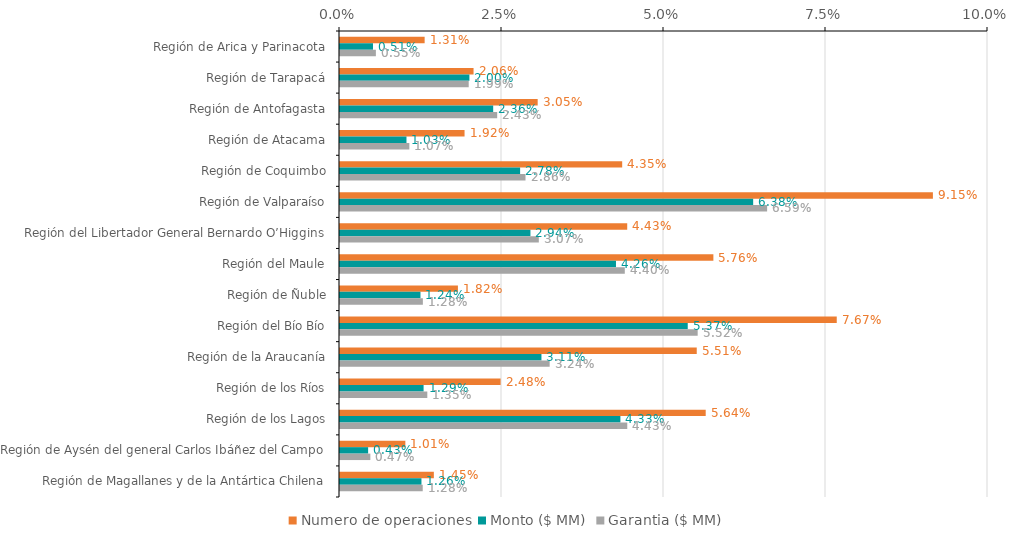
| Category | Numero de operaciones | Monto ($ MM) | Garantia ($ MM) |
|---|---|---|---|
| Región de Arica y Parinacota | 0.013 | 0.005 | 0.006 |
| Región de Tarapacá | 0.021 | 0.02 | 0.02 |
| Región de Antofagasta | 0.031 | 0.024 | 0.024 |
| Región de Atacama | 0.019 | 0.01 | 0.011 |
| Región de Coquimbo | 0.044 | 0.028 | 0.029 |
| Región de Valparaíso | 0.091 | 0.064 | 0.066 |
| Región del Libertador General Bernardo O’Higgins | 0.044 | 0.029 | 0.031 |
| Región del Maule | 0.058 | 0.043 | 0.044 |
| Región de Ñuble | 0.018 | 0.012 | 0.013 |
| Región del Bío Bío | 0.077 | 0.054 | 0.055 |
| Región de la Araucanía | 0.055 | 0.031 | 0.032 |
| Región de los Ríos | 0.025 | 0.013 | 0.013 |
| Región de los Lagos | 0.056 | 0.043 | 0.044 |
| Región de Aysén del general Carlos Ibáñez del Campo | 0.01 | 0.004 | 0.005 |
| Región de Magallanes y de la Antártica Chilena | 0.014 | 0.013 | 0.013 |